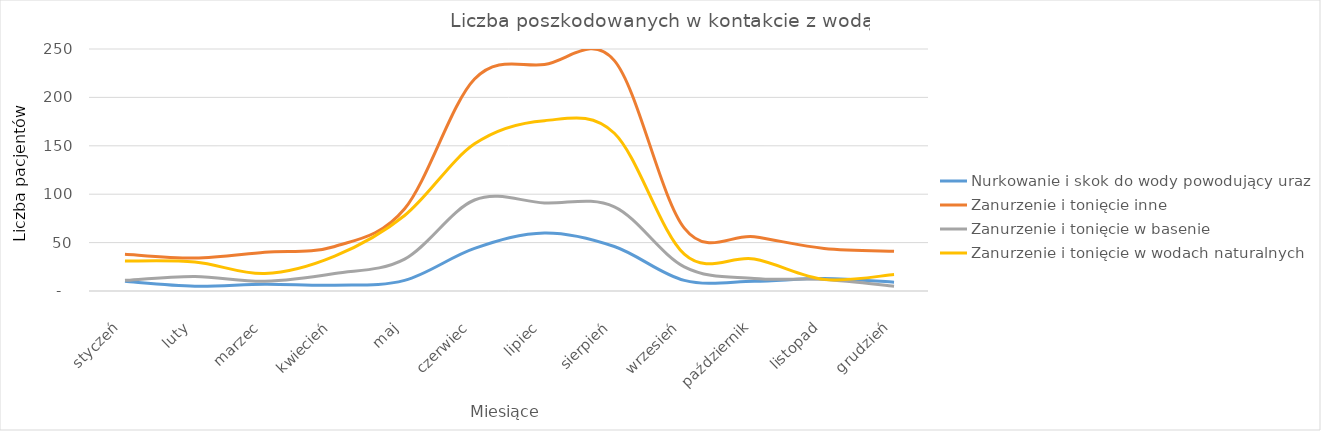
| Category | Nurkowanie i skok do wody powodujący uraz | Zanurzenie i tonięcie inne | Zanurzenie i tonięcie w basenie | Zanurzenie i tonięcie w wodach naturalnych |
|---|---|---|---|---|
| styczeń | 10 | 38 | 11 | 31 |
| luty | 5 | 34 | 15 | 30 |
| marzec | 7 | 40 | 10 | 18 |
| kwiecień | 6 | 46 | 18 | 36 |
| maj | 11 | 85 | 33 | 78 |
| czerwiec | 44 | 219 | 94 | 152 |
| lipiec | 60 | 234 | 91 | 176 |
| sierpień | 46 | 238 | 87 | 163 |
| wrzesień | 11 | 65 | 25 | 38 |
| październik | 10 | 56 | 13 | 33 |
| listopad | 13 | 44 | 12 | 12 |
| grudzień | 9 | 41 | 5 | 17 |